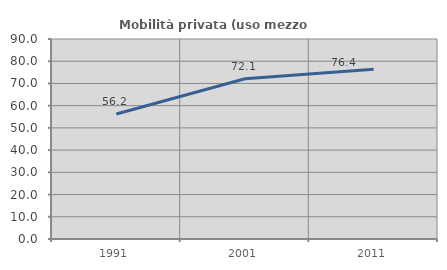
| Category | Mobilità privata (uso mezzo privato) |
|---|---|
| 1991.0 | 56.224 |
| 2001.0 | 72.112 |
| 2011.0 | 76.403 |